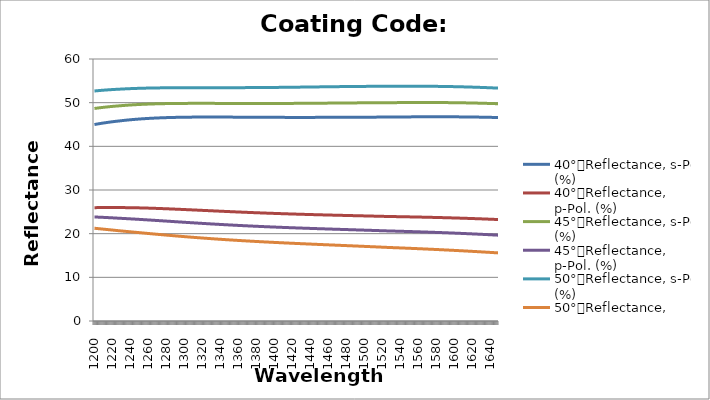
| Category | 40°，Reflectance, s-Pol. (%) | 40°，Reflectance, p-Pol. (%) | 45°，Reflectance, s-Pol. (%) | 45°，Reflectance, p-Pol. (%) | 50°，Reflectance, s-Pol. (%) | 50°，Reflectance, p-Pol. (%) |
|---|---|---|---|---|---|---|
| 1200.0 | 44.991 | 25.954 | 48.669 | 23.822 | 52.672 | 21.237 |
| 1201.0 | 45.028 | 25.958 | 48.697 | 23.814 | 52.692 | 21.217 |
| 1202.0 | 45.066 | 25.962 | 48.726 | 23.806 | 52.712 | 21.197 |
| 1203.0 | 45.102 | 25.966 | 48.753 | 23.797 | 52.732 | 21.177 |
| 1204.0 | 45.138 | 25.97 | 48.781 | 23.788 | 52.752 | 21.157 |
| 1205.0 | 45.173 | 25.973 | 48.807 | 23.779 | 52.77 | 21.136 |
| 1206.0 | 45.208 | 25.976 | 48.833 | 23.77 | 52.789 | 21.116 |
| 1207.0 | 45.242 | 25.979 | 48.859 | 23.761 | 52.806 | 21.096 |
| 1208.0 | 45.275 | 25.981 | 48.884 | 23.751 | 52.824 | 21.075 |
| 1209.0 | 45.308 | 25.984 | 48.908 | 23.741 | 52.841 | 21.055 |
| 1210.0 | 45.34 | 25.985 | 48.932 | 23.732 | 52.858 | 21.034 |
| 1211.0 | 45.371 | 25.987 | 48.956 | 23.721 | 52.874 | 21.014 |
| 1212.0 | 45.402 | 25.988 | 48.978 | 23.711 | 52.89 | 20.993 |
| 1213.0 | 45.433 | 25.989 | 49.001 | 23.701 | 52.905 | 20.972 |
| 1214.0 | 45.462 | 25.99 | 49.023 | 23.69 | 52.92 | 20.951 |
| 1215.0 | 45.492 | 25.99 | 49.044 | 23.679 | 52.934 | 20.93 |
| 1216.0 | 45.52 | 25.99 | 49.065 | 23.668 | 52.949 | 20.91 |
| 1217.0 | 45.548 | 25.99 | 49.086 | 23.657 | 52.962 | 20.889 |
| 1218.0 | 45.576 | 25.99 | 49.106 | 23.646 | 52.976 | 20.868 |
| 1219.0 | 45.603 | 25.989 | 49.125 | 23.635 | 52.989 | 20.847 |
| 1220.0 | 45.629 | 25.988 | 49.144 | 23.623 | 53.002 | 20.826 |
| 1221.0 | 45.655 | 25.987 | 49.163 | 23.612 | 53.014 | 20.805 |
| 1222.0 | 45.681 | 25.986 | 49.181 | 23.6 | 53.026 | 20.784 |
| 1223.0 | 45.706 | 25.984 | 49.199 | 23.588 | 53.038 | 20.762 |
| 1224.0 | 45.73 | 25.982 | 49.217 | 23.576 | 53.049 | 20.741 |
| 1225.0 | 45.754 | 25.98 | 49.234 | 23.564 | 53.06 | 20.72 |
| 1226.0 | 45.777 | 25.978 | 49.25 | 23.552 | 53.07 | 20.699 |
| 1227.0 | 45.8 | 25.975 | 49.266 | 23.539 | 53.081 | 20.678 |
| 1228.0 | 45.824 | 25.974 | 49.283 | 23.528 | 53.092 | 20.658 |
| 1229.0 | 45.848 | 25.973 | 49.301 | 23.517 | 53.104 | 20.639 |
| 1230.0 | 45.872 | 25.971 | 49.318 | 23.506 | 53.115 | 20.619 |
| 1231.0 | 45.895 | 25.97 | 49.334 | 23.496 | 53.127 | 20.6 |
| 1232.0 | 45.918 | 25.968 | 49.351 | 23.485 | 53.138 | 20.581 |
| 1233.0 | 45.94 | 25.966 | 49.367 | 23.474 | 53.148 | 20.561 |
| 1234.0 | 45.962 | 25.964 | 49.382 | 23.462 | 53.158 | 20.542 |
| 1235.0 | 45.983 | 25.962 | 49.398 | 23.451 | 53.168 | 20.523 |
| 1236.0 | 46.004 | 25.96 | 49.412 | 23.44 | 53.178 | 20.503 |
| 1237.0 | 46.025 | 25.957 | 49.427 | 23.428 | 53.188 | 20.484 |
| 1238.0 | 46.045 | 25.954 | 49.441 | 23.416 | 53.197 | 20.464 |
| 1239.0 | 46.065 | 25.951 | 49.455 | 23.405 | 53.206 | 20.445 |
| 1240.0 | 46.084 | 25.948 | 49.468 | 23.393 | 53.214 | 20.426 |
| 1241.0 | 46.103 | 25.945 | 49.481 | 23.381 | 53.223 | 20.406 |
| 1242.0 | 46.121 | 25.941 | 49.494 | 23.369 | 53.231 | 20.387 |
| 1243.0 | 46.139 | 25.937 | 49.507 | 23.357 | 53.239 | 20.368 |
| 1244.0 | 46.157 | 25.934 | 49.519 | 23.345 | 53.247 | 20.348 |
| 1245.0 | 46.174 | 25.929 | 49.531 | 23.333 | 53.254 | 20.329 |
| 1246.0 | 46.191 | 25.925 | 49.542 | 23.321 | 53.262 | 20.31 |
| 1247.0 | 46.208 | 25.921 | 49.553 | 23.309 | 53.269 | 20.291 |
| 1248.0 | 46.224 | 25.916 | 49.564 | 23.296 | 53.275 | 20.271 |
| 1249.0 | 46.24 | 25.912 | 49.575 | 23.284 | 53.282 | 20.252 |
| 1250.0 | 46.255 | 25.907 | 49.585 | 23.271 | 53.288 | 20.233 |
| 1251.0 | 46.27 | 25.902 | 49.595 | 23.259 | 53.295 | 20.214 |
| 1252.0 | 46.285 | 25.896 | 49.605 | 23.246 | 53.301 | 20.194 |
| 1253.0 | 46.299 | 25.891 | 49.615 | 23.234 | 53.306 | 20.175 |
| 1254.0 | 46.313 | 25.886 | 49.624 | 23.221 | 53.312 | 20.156 |
| 1255.0 | 46.327 | 25.88 | 49.633 | 23.208 | 53.317 | 20.137 |
| 1256.0 | 46.34 | 25.874 | 49.642 | 23.195 | 53.323 | 20.118 |
| 1257.0 | 46.353 | 25.868 | 49.65 | 23.182 | 53.328 | 20.099 |
| 1258.0 | 46.366 | 25.862 | 49.658 | 23.169 | 53.332 | 20.08 |
| 1259.0 | 46.378 | 25.856 | 49.666 | 23.156 | 53.337 | 20.061 |
| 1260.0 | 46.39 | 25.85 | 49.674 | 23.144 | 53.342 | 20.042 |
| 1261.0 | 46.402 | 25.844 | 49.682 | 23.13 | 53.346 | 20.023 |
| 1262.0 | 46.414 | 25.837 | 49.689 | 23.117 | 53.35 | 20.004 |
| 1263.0 | 46.425 | 25.831 | 49.696 | 23.104 | 53.354 | 19.986 |
| 1264.0 | 46.436 | 25.824 | 49.703 | 23.091 | 53.358 | 19.967 |
| 1265.0 | 46.446 | 25.817 | 49.71 | 23.078 | 53.362 | 19.948 |
| 1266.0 | 46.456 | 25.81 | 49.716 | 23.065 | 53.366 | 19.929 |
| 1267.0 | 46.466 | 25.803 | 49.722 | 23.052 | 53.369 | 19.911 |
| 1268.0 | 46.476 | 25.796 | 49.728 | 23.038 | 53.372 | 19.892 |
| 1269.0 | 46.486 | 25.789 | 49.734 | 23.025 | 53.376 | 19.874 |
| 1270.0 | 46.495 | 25.782 | 49.74 | 23.012 | 53.379 | 19.855 |
| 1271.0 | 46.504 | 25.774 | 49.745 | 22.998 | 53.382 | 19.837 |
| 1272.0 | 46.513 | 25.767 | 49.75 | 22.985 | 53.384 | 19.818 |
| 1273.0 | 46.521 | 25.759 | 49.755 | 22.972 | 53.387 | 19.8 |
| 1274.0 | 46.529 | 25.751 | 49.76 | 22.958 | 53.39 | 19.782 |
| 1275.0 | 46.537 | 25.744 | 49.764 | 22.945 | 53.392 | 19.763 |
| 1276.0 | 46.545 | 25.736 | 49.769 | 22.932 | 53.394 | 19.745 |
| 1277.0 | 46.552 | 25.728 | 49.773 | 22.918 | 53.396 | 19.727 |
| 1278.0 | 46.56 | 25.72 | 49.777 | 22.905 | 53.399 | 19.709 |
| 1279.0 | 46.567 | 25.712 | 49.781 | 22.892 | 53.401 | 19.691 |
| 1280.0 | 46.573 | 25.703 | 49.785 | 22.878 | 53.402 | 19.673 |
| 1281.0 | 46.58 | 25.695 | 49.789 | 22.865 | 53.404 | 19.655 |
| 1282.0 | 46.586 | 25.687 | 49.792 | 22.851 | 53.406 | 19.637 |
| 1283.0 | 46.592 | 25.678 | 49.796 | 22.838 | 53.408 | 19.619 |
| 1284.0 | 46.598 | 25.67 | 49.799 | 22.825 | 53.409 | 19.601 |
| 1285.0 | 46.604 | 25.661 | 49.802 | 22.811 | 53.411 | 19.584 |
| 1286.0 | 46.61 | 25.653 | 49.805 | 22.798 | 53.412 | 19.566 |
| 1287.0 | 46.615 | 25.644 | 49.808 | 22.784 | 53.413 | 19.548 |
| 1288.0 | 46.62 | 25.635 | 49.81 | 22.771 | 53.415 | 19.531 |
| 1289.0 | 46.625 | 25.627 | 49.813 | 22.758 | 53.416 | 19.513 |
| 1290.0 | 46.63 | 25.618 | 49.815 | 22.744 | 53.417 | 19.496 |
| 1291.0 | 46.634 | 25.609 | 49.817 | 22.731 | 53.418 | 19.479 |
| 1292.0 | 46.639 | 25.6 | 49.82 | 22.718 | 53.419 | 19.461 |
| 1293.0 | 46.643 | 25.591 | 49.822 | 22.704 | 53.42 | 19.444 |
| 1294.0 | 46.647 | 25.582 | 49.824 | 22.691 | 53.421 | 19.427 |
| 1295.0 | 46.651 | 25.573 | 49.825 | 22.678 | 53.421 | 19.41 |
| 1296.0 | 46.654 | 25.564 | 49.827 | 22.665 | 53.422 | 19.393 |
| 1297.0 | 46.658 | 25.555 | 49.828 | 22.651 | 53.423 | 19.376 |
| 1298.0 | 46.661 | 25.546 | 49.83 | 22.638 | 53.423 | 19.359 |
| 1299.0 | 46.665 | 25.536 | 49.831 | 22.625 | 53.424 | 19.342 |
| 1300.0 | 46.668 | 25.527 | 49.833 | 22.612 | 53.424 | 19.326 |
| 1301.0 | 46.671 | 25.518 | 49.834 | 22.599 | 53.425 | 19.309 |
| 1302.0 | 46.673 | 25.509 | 49.835 | 22.585 | 53.425 | 19.292 |
| 1303.0 | 46.676 | 25.499 | 49.836 | 22.572 | 53.426 | 19.276 |
| 1304.0 | 46.678 | 25.49 | 49.837 | 22.559 | 53.426 | 19.259 |
| 1305.0 | 46.681 | 25.48 | 49.838 | 22.546 | 53.426 | 19.243 |
| 1306.0 | 46.683 | 25.471 | 49.839 | 22.533 | 53.427 | 19.227 |
| 1307.0 | 46.685 | 25.462 | 49.839 | 22.52 | 53.427 | 19.21 |
| 1308.0 | 46.687 | 25.452 | 49.84 | 22.507 | 53.427 | 19.194 |
| 1309.0 | 46.689 | 25.443 | 49.84 | 22.494 | 53.427 | 19.178 |
| 1310.0 | 46.691 | 25.433 | 49.841 | 22.481 | 53.428 | 19.162 |
| 1311.0 | 46.692 | 25.424 | 49.841 | 22.469 | 53.428 | 19.146 |
| 1312.0 | 46.694 | 25.414 | 49.842 | 22.456 | 53.428 | 19.13 |
| 1313.0 | 46.695 | 25.405 | 49.842 | 22.443 | 53.428 | 19.114 |
| 1314.0 | 46.697 | 25.395 | 49.842 | 22.43 | 53.428 | 19.099 |
| 1315.0 | 46.698 | 25.386 | 49.842 | 22.418 | 53.428 | 19.083 |
| 1316.0 | 46.699 | 25.376 | 49.842 | 22.405 | 53.428 | 19.067 |
| 1317.0 | 46.7 | 25.366 | 49.842 | 22.392 | 53.428 | 19.052 |
| 1318.0 | 46.701 | 25.357 | 49.842 | 22.38 | 53.428 | 19.036 |
| 1319.0 | 46.702 | 25.347 | 49.842 | 22.367 | 53.428 | 19.021 |
| 1320.0 | 46.702 | 25.338 | 49.842 | 22.354 | 53.428 | 19.006 |
| 1321.0 | 46.703 | 25.328 | 49.842 | 22.342 | 53.428 | 18.99 |
| 1322.0 | 46.703 | 25.319 | 49.842 | 22.33 | 53.428 | 18.975 |
| 1323.0 | 46.704 | 25.309 | 49.842 | 22.317 | 53.428 | 18.96 |
| 1324.0 | 46.704 | 25.299 | 49.842 | 22.305 | 53.428 | 18.945 |
| 1325.0 | 46.704 | 25.29 | 49.841 | 22.292 | 53.428 | 18.93 |
| 1326.0 | 46.705 | 25.28 | 49.841 | 22.28 | 53.428 | 18.915 |
| 1327.0 | 46.705 | 25.271 | 49.841 | 22.268 | 53.428 | 18.9 |
| 1328.0 | 46.705 | 25.261 | 49.84 | 22.256 | 53.428 | 18.886 |
| 1329.0 | 46.705 | 25.252 | 49.84 | 22.244 | 53.428 | 18.871 |
| 1330.0 | 46.705 | 25.242 | 49.84 | 22.232 | 53.428 | 18.856 |
| 1331.0 | 46.705 | 25.232 | 49.839 | 22.22 | 53.429 | 18.842 |
| 1332.0 | 46.704 | 25.223 | 49.838 | 22.208 | 53.429 | 18.827 |
| 1333.0 | 46.704 | 25.214 | 49.838 | 22.196 | 53.429 | 18.813 |
| 1334.0 | 46.704 | 25.204 | 49.838 | 22.184 | 53.429 | 18.799 |
| 1335.0 | 46.703 | 25.194 | 49.837 | 22.172 | 53.429 | 18.784 |
| 1336.0 | 46.703 | 25.185 | 49.836 | 22.16 | 53.429 | 18.77 |
| 1337.0 | 46.702 | 25.176 | 49.836 | 22.148 | 53.429 | 18.756 |
| 1338.0 | 46.702 | 25.166 | 49.835 | 22.137 | 53.429 | 18.742 |
| 1339.0 | 46.701 | 25.157 | 49.835 | 22.125 | 53.429 | 18.728 |
| 1340.0 | 46.701 | 25.147 | 49.834 | 22.114 | 53.43 | 18.714 |
| 1341.0 | 46.7 | 25.138 | 49.833 | 22.102 | 53.43 | 18.701 |
| 1342.0 | 46.699 | 25.129 | 49.833 | 22.091 | 53.43 | 18.687 |
| 1343.0 | 46.699 | 25.119 | 49.832 | 22.079 | 53.43 | 18.673 |
| 1344.0 | 46.698 | 25.11 | 49.832 | 22.068 | 53.43 | 18.66 |
| 1345.0 | 46.697 | 25.101 | 49.831 | 22.056 | 53.431 | 18.646 |
| 1346.0 | 46.696 | 25.091 | 49.83 | 22.045 | 53.431 | 18.633 |
| 1347.0 | 46.695 | 25.082 | 49.83 | 22.034 | 53.431 | 18.619 |
| 1348.0 | 46.694 | 25.073 | 49.829 | 22.023 | 53.432 | 18.606 |
| 1349.0 | 46.693 | 25.064 | 49.828 | 22.012 | 53.432 | 18.593 |
| 1350.0 | 46.692 | 25.055 | 49.828 | 22.001 | 53.432 | 18.58 |
| 1351.0 | 46.691 | 25.046 | 49.827 | 21.99 | 53.433 | 18.567 |
| 1352.0 | 46.69 | 25.036 | 49.826 | 21.979 | 53.433 | 18.554 |
| 1353.0 | 46.689 | 25.027 | 49.826 | 21.968 | 53.434 | 18.541 |
| 1354.0 | 46.688 | 25.018 | 49.825 | 21.957 | 53.434 | 18.528 |
| 1355.0 | 46.687 | 25.009 | 49.825 | 21.946 | 53.435 | 18.515 |
| 1356.0 | 46.686 | 25 | 49.824 | 21.935 | 53.435 | 18.502 |
| 1357.0 | 46.685 | 24.991 | 49.824 | 21.925 | 53.436 | 18.49 |
| 1358.0 | 46.684 | 24.982 | 49.823 | 21.914 | 53.436 | 18.477 |
| 1359.0 | 46.683 | 24.974 | 49.822 | 21.904 | 53.437 | 18.464 |
| 1360.0 | 46.682 | 24.965 | 49.822 | 21.893 | 53.438 | 18.452 |
| 1361.0 | 46.68 | 24.956 | 49.821 | 21.882 | 53.438 | 18.439 |
| 1362.0 | 46.679 | 24.947 | 49.821 | 21.872 | 53.439 | 18.427 |
| 1363.0 | 46.678 | 24.938 | 49.82 | 21.862 | 53.44 | 18.415 |
| 1364.0 | 46.677 | 24.93 | 49.82 | 21.851 | 53.441 | 18.402 |
| 1365.0 | 46.676 | 24.921 | 49.82 | 21.841 | 53.442 | 18.39 |
| 1366.0 | 46.674 | 24.912 | 49.819 | 21.831 | 53.442 | 18.378 |
| 1367.0 | 46.673 | 24.904 | 49.819 | 21.821 | 53.443 | 18.366 |
| 1368.0 | 46.672 | 24.895 | 49.818 | 21.811 | 53.444 | 18.354 |
| 1369.0 | 46.671 | 24.887 | 49.818 | 21.801 | 53.445 | 18.342 |
| 1370.0 | 46.67 | 24.878 | 49.818 | 21.791 | 53.446 | 18.33 |
| 1371.0 | 46.668 | 24.87 | 49.817 | 21.781 | 53.447 | 18.319 |
| 1372.0 | 46.667 | 24.861 | 49.817 | 21.771 | 53.448 | 18.307 |
| 1373.0 | 46.666 | 24.853 | 49.817 | 21.761 | 53.449 | 18.295 |
| 1374.0 | 46.665 | 24.844 | 49.816 | 21.751 | 53.45 | 18.284 |
| 1375.0 | 46.664 | 24.836 | 49.816 | 21.742 | 53.452 | 18.272 |
| 1376.0 | 46.662 | 24.828 | 49.816 | 21.732 | 53.453 | 18.26 |
| 1377.0 | 46.661 | 24.82 | 49.816 | 21.722 | 53.454 | 18.249 |
| 1378.0 | 46.66 | 24.812 | 49.816 | 21.713 | 53.455 | 18.238 |
| 1379.0 | 46.659 | 24.803 | 49.816 | 21.703 | 53.456 | 18.226 |
| 1380.0 | 46.658 | 24.795 | 49.815 | 21.694 | 53.458 | 18.215 |
| 1381.0 | 46.657 | 24.787 | 49.815 | 21.684 | 53.459 | 18.204 |
| 1382.0 | 46.656 | 24.779 | 49.815 | 21.675 | 53.46 | 18.193 |
| 1383.0 | 46.654 | 24.771 | 49.815 | 21.666 | 53.462 | 18.182 |
| 1384.0 | 46.653 | 24.763 | 49.815 | 21.657 | 53.463 | 18.17 |
| 1385.0 | 46.652 | 24.755 | 49.815 | 21.647 | 53.465 | 18.16 |
| 1386.0 | 46.651 | 24.748 | 49.815 | 21.638 | 53.466 | 18.148 |
| 1387.0 | 46.65 | 24.74 | 49.815 | 21.629 | 53.468 | 18.138 |
| 1388.0 | 46.649 | 24.732 | 49.816 | 21.62 | 53.47 | 18.127 |
| 1389.0 | 46.648 | 24.724 | 49.816 | 21.611 | 53.471 | 18.116 |
| 1390.0 | 46.647 | 24.716 | 49.816 | 21.602 | 53.473 | 18.105 |
| 1391.0 | 46.646 | 24.709 | 49.816 | 21.593 | 53.474 | 18.095 |
| 1392.0 | 46.645 | 24.701 | 49.816 | 21.584 | 53.476 | 18.084 |
| 1393.0 | 46.644 | 24.694 | 49.817 | 21.576 | 53.478 | 18.073 |
| 1394.0 | 46.643 | 24.686 | 49.817 | 21.567 | 53.48 | 18.063 |
| 1395.0 | 46.642 | 24.679 | 49.817 | 21.558 | 53.482 | 18.052 |
| 1396.0 | 46.642 | 24.671 | 49.818 | 21.55 | 53.483 | 18.042 |
| 1397.0 | 46.641 | 24.664 | 49.818 | 21.541 | 53.485 | 18.031 |
| 1398.0 | 46.64 | 24.656 | 49.818 | 21.532 | 53.487 | 18.021 |
| 1399.0 | 46.639 | 24.649 | 49.819 | 21.524 | 53.489 | 18.011 |
| 1400.0 | 46.638 | 24.642 | 49.819 | 21.515 | 53.491 | 18 |
| 1401.0 | 46.638 | 24.635 | 49.82 | 21.507 | 53.493 | 17.99 |
| 1402.0 | 46.637 | 24.628 | 49.82 | 21.498 | 53.495 | 17.98 |
| 1403.0 | 46.636 | 24.62 | 49.821 | 21.49 | 53.497 | 17.97 |
| 1404.0 | 46.636 | 24.613 | 49.822 | 21.482 | 53.499 | 17.96 |
| 1405.0 | 46.635 | 24.606 | 49.822 | 21.474 | 53.501 | 17.95 |
| 1406.0 | 46.634 | 24.599 | 49.823 | 21.465 | 53.503 | 17.94 |
| 1407.0 | 46.634 | 24.592 | 49.824 | 21.457 | 53.506 | 17.93 |
| 1408.0 | 46.633 | 24.585 | 49.824 | 21.449 | 53.508 | 17.92 |
| 1409.0 | 46.632 | 24.578 | 49.825 | 21.441 | 53.51 | 17.91 |
| 1410.0 | 46.632 | 24.571 | 49.826 | 21.433 | 53.512 | 17.9 |
| 1411.0 | 46.632 | 24.565 | 49.827 | 21.425 | 53.514 | 17.89 |
| 1412.0 | 46.631 | 24.558 | 49.828 | 21.417 | 53.517 | 17.881 |
| 1413.0 | 46.631 | 24.551 | 49.828 | 21.409 | 53.519 | 17.871 |
| 1414.0 | 46.63 | 24.544 | 49.829 | 21.401 | 53.521 | 17.861 |
| 1415.0 | 46.63 | 24.538 | 49.83 | 21.394 | 53.524 | 17.852 |
| 1416.0 | 46.629 | 24.531 | 49.831 | 21.386 | 53.526 | 17.842 |
| 1417.0 | 46.629 | 24.524 | 49.832 | 21.378 | 53.528 | 17.832 |
| 1418.0 | 46.629 | 24.518 | 49.833 | 21.37 | 53.531 | 17.823 |
| 1419.0 | 46.628 | 24.511 | 49.834 | 21.362 | 53.533 | 17.813 |
| 1420.0 | 46.628 | 24.505 | 49.835 | 21.355 | 53.536 | 17.804 |
| 1421.0 | 46.628 | 24.498 | 49.836 | 21.347 | 53.538 | 17.794 |
| 1422.0 | 46.628 | 24.492 | 49.838 | 21.34 | 53.54 | 17.785 |
| 1423.0 | 46.628 | 24.486 | 49.839 | 21.332 | 53.543 | 17.775 |
| 1424.0 | 46.628 | 24.479 | 49.84 | 21.325 | 53.546 | 17.766 |
| 1425.0 | 46.628 | 24.473 | 49.841 | 21.317 | 53.548 | 17.757 |
| 1426.0 | 46.627 | 24.467 | 49.842 | 21.31 | 53.551 | 17.747 |
| 1427.0 | 46.627 | 24.46 | 49.844 | 21.302 | 53.553 | 17.738 |
| 1428.0 | 46.627 | 24.454 | 49.845 | 21.295 | 53.556 | 17.729 |
| 1429.0 | 46.627 | 24.448 | 49.846 | 21.288 | 53.558 | 17.72 |
| 1430.0 | 46.627 | 24.442 | 49.848 | 21.28 | 53.561 | 17.71 |
| 1431.0 | 46.627 | 24.436 | 49.849 | 21.273 | 53.564 | 17.701 |
| 1432.0 | 46.628 | 24.43 | 49.85 | 21.266 | 53.566 | 17.692 |
| 1433.0 | 46.628 | 24.424 | 49.852 | 21.258 | 53.569 | 17.683 |
| 1434.0 | 46.628 | 24.418 | 49.853 | 21.251 | 53.571 | 17.674 |
| 1435.0 | 46.628 | 24.412 | 49.855 | 21.244 | 53.574 | 17.665 |
| 1436.0 | 46.628 | 24.406 | 49.856 | 21.237 | 53.577 | 17.656 |
| 1437.0 | 46.628 | 24.4 | 49.858 | 21.23 | 53.579 | 17.646 |
| 1438.0 | 46.628 | 24.394 | 49.859 | 21.223 | 53.582 | 17.638 |
| 1439.0 | 46.629 | 24.388 | 49.86 | 21.216 | 53.585 | 17.628 |
| 1440.0 | 46.629 | 24.383 | 49.862 | 21.209 | 53.587 | 17.62 |
| 1441.0 | 46.629 | 24.377 | 49.864 | 21.202 | 53.59 | 17.611 |
| 1442.0 | 46.63 | 24.371 | 49.865 | 21.195 | 53.593 | 17.602 |
| 1443.0 | 46.63 | 24.365 | 49.867 | 21.188 | 53.595 | 17.593 |
| 1444.0 | 46.63 | 24.36 | 49.868 | 21.181 | 53.598 | 17.584 |
| 1445.0 | 46.631 | 24.354 | 49.87 | 21.174 | 53.601 | 17.575 |
| 1446.0 | 46.631 | 24.348 | 49.872 | 21.167 | 53.603 | 17.566 |
| 1447.0 | 46.632 | 24.343 | 49.873 | 21.16 | 53.606 | 17.557 |
| 1448.0 | 46.632 | 24.337 | 49.875 | 21.153 | 53.609 | 17.548 |
| 1449.0 | 46.633 | 24.332 | 49.877 | 21.146 | 53.611 | 17.54 |
| 1450.0 | 46.633 | 24.326 | 49.878 | 21.14 | 53.614 | 17.531 |
| 1451.0 | 46.634 | 24.321 | 49.88 | 21.133 | 53.617 | 17.522 |
| 1452.0 | 46.634 | 24.315 | 49.882 | 21.126 | 53.62 | 17.513 |
| 1453.0 | 46.635 | 24.31 | 49.883 | 21.119 | 53.622 | 17.504 |
| 1454.0 | 46.636 | 24.304 | 49.885 | 21.113 | 53.625 | 17.496 |
| 1455.0 | 46.636 | 24.299 | 49.887 | 21.106 | 53.628 | 17.487 |
| 1456.0 | 46.637 | 24.294 | 49.889 | 21.099 | 53.63 | 17.478 |
| 1457.0 | 46.638 | 24.288 | 49.89 | 21.093 | 53.633 | 17.469 |
| 1458.0 | 46.638 | 24.283 | 49.892 | 21.086 | 53.635 | 17.46 |
| 1459.0 | 46.639 | 24.278 | 49.894 | 21.079 | 53.638 | 17.452 |
| 1460.0 | 46.64 | 24.272 | 49.896 | 21.073 | 53.641 | 17.443 |
| 1461.0 | 46.64 | 24.267 | 49.897 | 21.066 | 53.643 | 17.434 |
| 1462.0 | 46.641 | 24.262 | 49.899 | 21.059 | 53.646 | 17.426 |
| 1463.0 | 46.642 | 24.257 | 49.901 | 21.053 | 53.648 | 17.417 |
| 1464.0 | 46.643 | 24.251 | 49.903 | 21.046 | 53.651 | 17.408 |
| 1465.0 | 46.643 | 24.246 | 49.905 | 21.04 | 53.653 | 17.4 |
| 1466.0 | 46.644 | 24.241 | 49.906 | 21.033 | 53.656 | 17.391 |
| 1467.0 | 46.645 | 24.236 | 49.908 | 21.026 | 53.658 | 17.382 |
| 1468.0 | 46.646 | 24.231 | 49.91 | 21.02 | 53.661 | 17.373 |
| 1469.0 | 46.647 | 24.226 | 49.912 | 21.013 | 53.663 | 17.365 |
| 1470.0 | 46.648 | 24.221 | 49.914 | 21.007 | 53.666 | 17.356 |
| 1471.0 | 46.648 | 24.216 | 49.915 | 21 | 53.668 | 17.347 |
| 1472.0 | 46.649 | 24.21 | 49.917 | 20.994 | 53.671 | 17.339 |
| 1473.0 | 46.65 | 24.205 | 49.919 | 20.987 | 53.673 | 17.33 |
| 1474.0 | 46.651 | 24.2 | 49.921 | 20.981 | 53.676 | 17.321 |
| 1475.0 | 46.652 | 24.195 | 49.922 | 20.974 | 53.678 | 17.313 |
| 1476.0 | 46.653 | 24.19 | 49.924 | 20.968 | 53.68 | 17.304 |
| 1477.0 | 46.654 | 24.185 | 49.926 | 20.961 | 53.682 | 17.295 |
| 1478.0 | 46.655 | 24.18 | 49.928 | 20.955 | 53.685 | 17.287 |
| 1479.0 | 46.656 | 24.175 | 49.93 | 20.948 | 53.687 | 17.278 |
| 1480.0 | 46.657 | 24.17 | 49.931 | 20.942 | 53.689 | 17.269 |
| 1481.0 | 46.658 | 24.165 | 49.933 | 20.935 | 53.691 | 17.26 |
| 1482.0 | 46.659 | 24.16 | 49.935 | 20.929 | 53.694 | 17.252 |
| 1483.0 | 46.66 | 24.155 | 49.936 | 20.922 | 53.696 | 17.243 |
| 1484.0 | 46.661 | 24.15 | 49.938 | 20.916 | 53.698 | 17.234 |
| 1485.0 | 46.662 | 24.145 | 49.94 | 20.909 | 53.7 | 17.226 |
| 1486.0 | 46.663 | 24.14 | 49.942 | 20.903 | 53.702 | 17.217 |
| 1487.0 | 46.664 | 24.136 | 49.943 | 20.896 | 53.704 | 17.208 |
| 1488.0 | 46.665 | 24.131 | 49.945 | 20.89 | 53.706 | 17.199 |
| 1489.0 | 46.666 | 24.126 | 49.946 | 20.883 | 53.708 | 17.191 |
| 1490.0 | 46.667 | 24.121 | 49.948 | 20.876 | 53.71 | 17.182 |
| 1491.0 | 46.668 | 24.116 | 49.95 | 20.87 | 53.712 | 17.173 |
| 1492.0 | 46.669 | 24.111 | 49.951 | 20.863 | 53.713 | 17.164 |
| 1493.0 | 46.67 | 24.106 | 49.953 | 20.857 | 53.715 | 17.156 |
| 1494.0 | 46.671 | 24.101 | 49.954 | 20.85 | 53.717 | 17.147 |
| 1495.0 | 46.672 | 24.096 | 49.956 | 20.844 | 53.719 | 17.138 |
| 1496.0 | 46.672 | 24.091 | 49.957 | 20.837 | 53.72 | 17.129 |
| 1497.0 | 46.674 | 24.086 | 49.959 | 20.831 | 53.722 | 17.12 |
| 1498.0 | 46.674 | 24.082 | 49.96 | 20.824 | 53.723 | 17.111 |
| 1499.0 | 46.675 | 24.077 | 49.962 | 20.818 | 53.725 | 17.102 |
| 1500.0 | 46.676 | 24.072 | 49.963 | 20.811 | 53.726 | 17.094 |
| 1501.0 | 46.677 | 24.067 | 49.965 | 20.804 | 53.728 | 17.085 |
| 1502.0 | 46.678 | 24.062 | 49.966 | 20.798 | 53.729 | 17.076 |
| 1503.0 | 46.679 | 24.057 | 49.967 | 20.791 | 53.731 | 17.067 |
| 1504.0 | 46.68 | 24.052 | 49.968 | 20.784 | 53.732 | 17.058 |
| 1505.0 | 46.681 | 24.047 | 49.97 | 20.778 | 53.733 | 17.049 |
| 1506.0 | 46.682 | 24.042 | 49.971 | 20.771 | 53.734 | 17.04 |
| 1507.0 | 46.683 | 24.037 | 49.972 | 20.764 | 53.736 | 17.031 |
| 1508.0 | 46.684 | 24.032 | 49.974 | 20.758 | 53.737 | 17.022 |
| 1509.0 | 46.684 | 24.027 | 49.975 | 20.751 | 53.738 | 17.013 |
| 1510.0 | 46.685 | 24.022 | 49.976 | 20.744 | 53.739 | 17.004 |
| 1511.0 | 46.686 | 24.017 | 49.977 | 20.738 | 53.74 | 16.995 |
| 1512.0 | 46.687 | 24.012 | 49.978 | 20.731 | 53.741 | 16.986 |
| 1513.0 | 46.688 | 24.008 | 49.979 | 20.724 | 53.742 | 16.976 |
| 1514.0 | 46.688 | 24.002 | 49.98 | 20.717 | 53.742 | 16.967 |
| 1515.0 | 46.689 | 23.997 | 49.981 | 20.71 | 53.743 | 16.958 |
| 1516.0 | 46.69 | 23.992 | 49.982 | 20.704 | 53.744 | 16.949 |
| 1517.0 | 46.691 | 23.987 | 49.983 | 20.697 | 53.744 | 16.94 |
| 1518.0 | 46.691 | 23.982 | 49.984 | 20.69 | 53.745 | 16.931 |
| 1519.0 | 46.692 | 23.977 | 49.984 | 20.683 | 53.746 | 16.921 |
| 1520.0 | 46.693 | 23.972 | 49.985 | 20.676 | 53.746 | 16.912 |
| 1521.0 | 46.693 | 23.967 | 49.986 | 20.669 | 53.746 | 16.903 |
| 1522.0 | 46.694 | 23.962 | 49.986 | 20.662 | 53.747 | 16.893 |
| 1523.0 | 46.695 | 23.957 | 49.987 | 20.655 | 53.747 | 16.884 |
| 1524.0 | 46.695 | 23.952 | 49.988 | 20.648 | 53.747 | 16.875 |
| 1525.0 | 46.696 | 23.947 | 49.988 | 20.641 | 53.747 | 16.865 |
| 1526.0 | 46.696 | 23.942 | 49.989 | 20.634 | 53.747 | 16.856 |
| 1527.0 | 46.697 | 23.936 | 49.989 | 20.627 | 53.747 | 16.846 |
| 1528.0 | 46.698 | 23.932 | 49.99 | 20.621 | 53.748 | 16.838 |
| 1529.0 | 46.7 | 23.928 | 49.993 | 20.615 | 53.75 | 16.83 |
| 1530.0 | 46.703 | 23.925 | 49.995 | 20.61 | 53.752 | 16.822 |
| 1531.0 | 46.705 | 23.921 | 49.997 | 20.604 | 53.753 | 16.814 |
| 1532.0 | 46.707 | 23.918 | 49.999 | 20.598 | 53.754 | 16.806 |
| 1533.0 | 46.709 | 23.914 | 50.001 | 20.593 | 53.756 | 16.798 |
| 1534.0 | 46.712 | 23.91 | 50.003 | 20.587 | 53.757 | 16.79 |
| 1535.0 | 46.714 | 23.907 | 50.005 | 20.581 | 53.759 | 16.781 |
| 1536.0 | 46.716 | 23.903 | 50.007 | 20.576 | 53.76 | 16.773 |
| 1537.0 | 46.718 | 23.9 | 50.009 | 20.57 | 53.761 | 16.765 |
| 1538.0 | 46.72 | 23.896 | 50.01 | 20.564 | 53.762 | 16.757 |
| 1539.0 | 46.722 | 23.892 | 50.012 | 20.558 | 53.763 | 16.748 |
| 1540.0 | 46.724 | 23.888 | 50.014 | 20.553 | 53.764 | 16.74 |
| 1541.0 | 46.726 | 23.884 | 50.016 | 20.547 | 53.765 | 16.732 |
| 1542.0 | 46.728 | 23.881 | 50.017 | 20.541 | 53.766 | 16.724 |
| 1543.0 | 46.73 | 23.877 | 50.019 | 20.535 | 53.766 | 16.715 |
| 1544.0 | 46.731 | 23.873 | 50.02 | 20.529 | 53.767 | 16.707 |
| 1545.0 | 46.733 | 23.869 | 50.022 | 20.523 | 53.768 | 16.698 |
| 1546.0 | 46.735 | 23.865 | 50.023 | 20.517 | 53.768 | 16.69 |
| 1547.0 | 46.737 | 23.861 | 50.024 | 20.511 | 53.768 | 16.681 |
| 1548.0 | 46.738 | 23.857 | 50.025 | 20.505 | 53.769 | 16.673 |
| 1549.0 | 46.74 | 23.853 | 50.026 | 20.499 | 53.769 | 16.664 |
| 1550.0 | 46.741 | 23.849 | 50.028 | 20.493 | 53.769 | 16.656 |
| 1551.0 | 46.743 | 23.845 | 50.029 | 20.486 | 53.77 | 16.647 |
| 1552.0 | 46.744 | 23.841 | 50.03 | 20.48 | 53.77 | 16.638 |
| 1553.0 | 46.746 | 23.837 | 50.031 | 20.474 | 53.77 | 16.63 |
| 1554.0 | 46.747 | 23.833 | 50.032 | 20.468 | 53.769 | 16.621 |
| 1555.0 | 46.749 | 23.829 | 50.032 | 20.461 | 53.769 | 16.612 |
| 1556.0 | 46.75 | 23.824 | 50.033 | 20.455 | 53.769 | 16.603 |
| 1557.0 | 46.751 | 23.82 | 50.034 | 20.449 | 53.769 | 16.594 |
| 1558.0 | 46.753 | 23.816 | 50.034 | 20.442 | 53.768 | 16.586 |
| 1559.0 | 46.754 | 23.812 | 50.035 | 20.436 | 53.768 | 16.577 |
| 1560.0 | 46.755 | 23.807 | 50.035 | 20.429 | 53.767 | 16.568 |
| 1561.0 | 46.756 | 23.803 | 50.036 | 20.423 | 53.766 | 16.559 |
| 1562.0 | 46.757 | 23.798 | 50.036 | 20.416 | 53.766 | 16.55 |
| 1563.0 | 46.758 | 23.794 | 50.036 | 20.41 | 53.765 | 16.541 |
| 1564.0 | 46.759 | 23.79 | 50.037 | 20.403 | 53.764 | 16.532 |
| 1565.0 | 46.76 | 23.785 | 50.037 | 20.396 | 53.763 | 16.522 |
| 1566.0 | 46.761 | 23.78 | 50.037 | 20.389 | 53.762 | 16.513 |
| 1567.0 | 46.762 | 23.776 | 50.037 | 20.383 | 53.761 | 16.504 |
| 1568.0 | 46.762 | 23.771 | 50.037 | 20.376 | 53.759 | 16.495 |
| 1569.0 | 46.763 | 23.767 | 50.037 | 20.369 | 53.758 | 16.486 |
| 1570.0 | 46.764 | 23.762 | 50.037 | 20.362 | 53.756 | 16.476 |
| 1571.0 | 46.764 | 23.757 | 50.036 | 20.355 | 53.755 | 16.467 |
| 1572.0 | 46.765 | 23.752 | 50.036 | 20.348 | 53.753 | 16.457 |
| 1573.0 | 46.765 | 23.748 | 50.036 | 20.341 | 53.752 | 16.448 |
| 1574.0 | 46.766 | 23.743 | 50.035 | 20.334 | 53.75 | 16.438 |
| 1575.0 | 46.766 | 23.738 | 50.035 | 20.327 | 53.748 | 16.429 |
| 1576.0 | 46.766 | 23.733 | 50.034 | 20.32 | 53.746 | 16.419 |
| 1577.0 | 46.766 | 23.728 | 50.033 | 20.312 | 53.744 | 16.41 |
| 1578.0 | 46.766 | 23.723 | 50.032 | 20.305 | 53.742 | 16.4 |
| 1579.0 | 46.767 | 23.718 | 50.032 | 20.298 | 53.74 | 16.39 |
| 1580.0 | 46.767 | 23.713 | 50.031 | 20.29 | 53.737 | 16.381 |
| 1581.0 | 46.767 | 23.708 | 50.03 | 20.283 | 53.735 | 16.371 |
| 1582.0 | 46.767 | 23.702 | 50.029 | 20.276 | 53.732 | 16.361 |
| 1583.0 | 46.766 | 23.697 | 50.028 | 20.268 | 53.73 | 16.351 |
| 1584.0 | 46.766 | 23.692 | 50.026 | 20.261 | 53.727 | 16.341 |
| 1585.0 | 46.766 | 23.686 | 50.025 | 20.253 | 53.724 | 16.331 |
| 1586.0 | 46.766 | 23.681 | 50.024 | 20.246 | 53.721 | 16.321 |
| 1587.0 | 46.765 | 23.676 | 50.022 | 20.238 | 53.718 | 16.311 |
| 1588.0 | 46.765 | 23.67 | 50.02 | 20.23 | 53.715 | 16.301 |
| 1589.0 | 46.764 | 23.665 | 50.019 | 20.222 | 53.712 | 16.291 |
| 1590.0 | 46.764 | 23.659 | 50.017 | 20.215 | 53.709 | 16.281 |
| 1591.0 | 46.763 | 23.654 | 50.015 | 20.207 | 53.706 | 16.271 |
| 1592.0 | 46.763 | 23.648 | 50.014 | 20.199 | 53.702 | 16.261 |
| 1593.0 | 46.762 | 23.642 | 50.012 | 20.191 | 53.699 | 16.25 |
| 1594.0 | 46.761 | 23.637 | 50.01 | 20.183 | 53.695 | 16.24 |
| 1595.0 | 46.76 | 23.631 | 50.007 | 20.175 | 53.691 | 16.23 |
| 1596.0 | 46.759 | 23.625 | 50.005 | 20.167 | 53.687 | 16.219 |
| 1597.0 | 46.758 | 23.619 | 50.003 | 20.158 | 53.683 | 16.209 |
| 1598.0 | 46.757 | 23.613 | 50 | 20.15 | 53.679 | 16.198 |
| 1599.0 | 46.756 | 23.607 | 49.998 | 20.142 | 53.675 | 16.188 |
| 1600.0 | 46.755 | 23.601 | 49.996 | 20.134 | 53.671 | 16.177 |
| 1601.0 | 46.753 | 23.595 | 49.993 | 20.125 | 53.667 | 16.167 |
| 1602.0 | 46.752 | 23.589 | 49.99 | 20.117 | 53.662 | 16.156 |
| 1603.0 | 46.75 | 23.583 | 49.987 | 20.109 | 53.658 | 16.145 |
| 1604.0 | 46.749 | 23.577 | 49.984 | 20.1 | 53.653 | 16.135 |
| 1605.0 | 46.747 | 23.57 | 49.982 | 20.092 | 53.648 | 16.124 |
| 1606.0 | 46.746 | 23.564 | 49.978 | 20.083 | 53.644 | 16.113 |
| 1607.0 | 46.744 | 23.558 | 49.975 | 20.074 | 53.638 | 16.102 |
| 1608.0 | 46.742 | 23.551 | 49.972 | 20.066 | 53.634 | 16.091 |
| 1609.0 | 46.74 | 23.545 | 49.969 | 20.057 | 53.628 | 16.08 |
| 1610.0 | 46.738 | 23.538 | 49.965 | 20.048 | 53.623 | 16.069 |
| 1611.0 | 46.736 | 23.532 | 49.962 | 20.039 | 53.618 | 16.058 |
| 1612.0 | 46.734 | 23.525 | 49.958 | 20.03 | 53.612 | 16.047 |
| 1613.0 | 46.732 | 23.518 | 49.954 | 20.021 | 53.607 | 16.036 |
| 1614.0 | 46.73 | 23.512 | 49.951 | 20.012 | 53.601 | 16.025 |
| 1615.0 | 46.727 | 23.505 | 49.947 | 20.003 | 53.595 | 16.013 |
| 1616.0 | 46.725 | 23.498 | 49.943 | 19.994 | 53.59 | 16.002 |
| 1617.0 | 46.722 | 23.491 | 49.939 | 19.985 | 53.584 | 15.991 |
| 1618.0 | 46.72 | 23.484 | 49.935 | 19.976 | 53.577 | 15.979 |
| 1619.0 | 46.717 | 23.477 | 49.93 | 19.966 | 53.571 | 15.968 |
| 1620.0 | 46.714 | 23.47 | 49.926 | 19.957 | 53.565 | 15.957 |
| 1621.0 | 46.712 | 23.463 | 49.922 | 19.948 | 53.559 | 15.945 |
| 1622.0 | 46.709 | 23.456 | 49.917 | 19.938 | 53.552 | 15.934 |
| 1623.0 | 46.706 | 23.448 | 49.913 | 19.929 | 53.545 | 15.922 |
| 1624.0 | 46.703 | 23.441 | 49.908 | 19.919 | 53.539 | 15.91 |
| 1625.0 | 46.7 | 23.434 | 49.903 | 19.91 | 53.532 | 15.898 |
| 1626.0 | 46.696 | 23.426 | 49.898 | 19.9 | 53.525 | 15.887 |
| 1627.0 | 46.693 | 23.419 | 49.893 | 19.89 | 53.518 | 15.875 |
| 1628.0 | 46.69 | 23.411 | 49.888 | 19.88 | 53.511 | 15.863 |
| 1629.0 | 46.686 | 23.404 | 49.883 | 19.87 | 53.504 | 15.851 |
| 1630.0 | 46.682 | 23.396 | 49.878 | 19.86 | 53.496 | 15.839 |
| 1631.0 | 46.679 | 23.388 | 49.872 | 19.851 | 53.489 | 15.827 |
| 1632.0 | 46.675 | 23.381 | 49.867 | 19.841 | 53.481 | 15.815 |
| 1633.0 | 46.671 | 23.373 | 49.861 | 19.83 | 53.474 | 15.803 |
| 1634.0 | 46.668 | 23.365 | 49.856 | 19.82 | 53.466 | 15.791 |
| 1635.0 | 46.664 | 23.357 | 49.85 | 19.81 | 53.458 | 15.779 |
| 1636.0 | 46.66 | 23.349 | 49.844 | 19.8 | 53.45 | 15.767 |
| 1637.0 | 46.655 | 23.341 | 49.838 | 19.79 | 53.442 | 15.754 |
| 1638.0 | 46.651 | 23.333 | 49.832 | 19.779 | 53.433 | 15.742 |
| 1639.0 | 46.647 | 23.325 | 49.826 | 19.769 | 53.425 | 15.73 |
| 1640.0 | 46.642 | 23.317 | 49.819 | 19.758 | 53.417 | 15.718 |
| 1641.0 | 46.638 | 23.308 | 49.813 | 19.748 | 53.408 | 15.705 |
| 1642.0 | 46.633 | 23.3 | 49.806 | 19.737 | 53.399 | 15.692 |
| 1643.0 | 46.629 | 23.292 | 49.8 | 19.727 | 53.39 | 15.68 |
| 1644.0 | 46.624 | 23.283 | 49.793 | 19.716 | 53.382 | 15.667 |
| 1645.0 | 46.619 | 23.275 | 49.786 | 19.705 | 53.373 | 15.655 |
| 1646.0 | 46.614 | 23.266 | 49.78 | 19.694 | 53.364 | 15.642 |
| 1647.0 | 46.609 | 23.257 | 49.773 | 19.684 | 53.354 | 15.629 |
| 1648.0 | 46.604 | 23.249 | 49.766 | 19.673 | 53.345 | 15.617 |
| 1649.0 | 46.599 | 23.24 | 49.758 | 19.662 | 53.335 | 15.604 |
| 1650.0 | 46.593 | 23.231 | 49.751 | 19.651 | 53.326 | 15.591 |